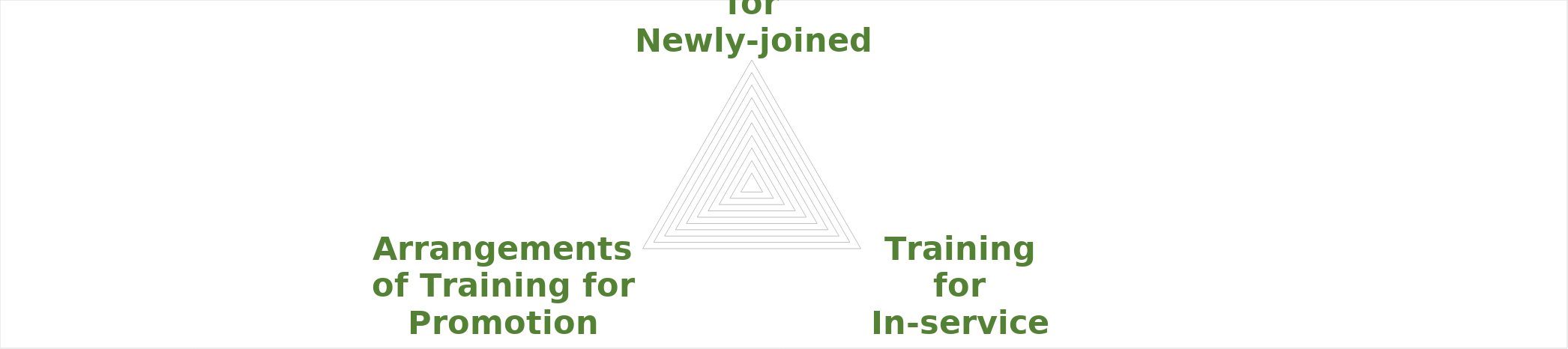
| Category | Series 0 |
|---|---|
| Training Programme for Newly-joined Teachers | 0 |
| Training for In-service Teachers | 0 |
| Arrangements of Training for Promotion | 0 |